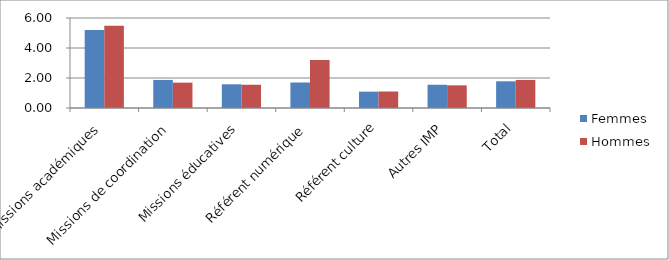
| Category | Femmes | Hommes |
|---|---|---|
| Missions académiques | 5.2 | 5.49 |
| Missions de coordination | 1.87 | 1.69 |
| Missions éducatives | 1.58 | 1.55 |
| Référent numérique | 1.7 | 3.2 |
| Référent culture | 1.09 | 1.1 |
| Autres IMP | 1.55 | 1.51 |
| Total | 1.78 | 1.87 |